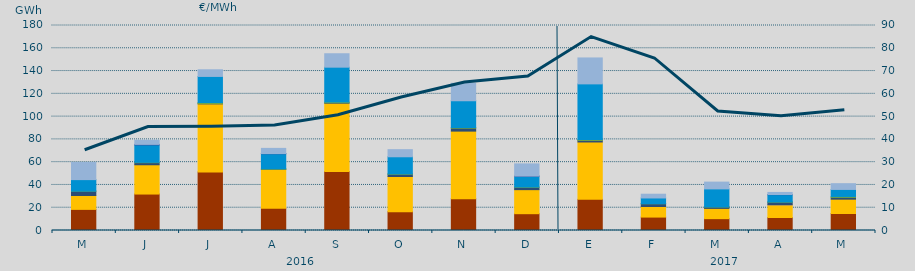
| Category | Carbón | Ciclo Combinado | Cogeneración | Consumo Bombeo | Eólica | Hidráulica | Nuclear | Turbinación bombeo |
|---|---|---|---|---|---|---|---|---|
| M | 18542.9 | 12194.7 | 0 | 3802.8 | 29.4 | 10110.1 | 0 | 15019.5 |
| J | 32003.2 | 25715 | 0 | 1834 | 309.7 | 15345.5 | 404.7 | 3667.5 |
| J | 51324.2 | 59857.5 | 0 | 381.3 | 830.5 | 22884.7 | 0 | 5850 |
| A | 19608 | 34074 | 0 | 154.8 | 407.6 | 13164.8 | 150 | 4538.1 |
| S | 51777.2 | 60003.2 | 0 | 418.8 | 585.4 | 30624.4 | 0 | 11791 |
| O | 16527.1 | 30870.5 | 0 | 2014.8 | 341.7 | 14982.5 | 0 | 6233.4 |
| N | 27911.6 | 59353 | 0 | 2603.5 | 562.8 | 23494.9 | 0 | 15319.9 |
| D | 14759.8 | 21112.2 | 0 | 2054.9 | 290 | 9517.7 | 60 | 10705.2 |
| E | 27333.2 | 50390.4 | 0 | 1420.1 | 796.7 | 48799.7 | 0 | 22768.5 |
| F | 11782.3 | 9297.4 | 0 | 2429.3 | 37.7 | 5011.6 | 0 | 3301.6 |
| M | 10392.3 | 9024.8 | 0 | 1213 | 83.9 | 15815.6 | 0 | 5970.4 |
| A | 11417.3 | 11177.4 | 1 | 2298.7 | 146.3 | 6448.1 | 105 | 1824.9 |
| M | 14921.9 | 12578.5 | 0 | 1623.5 | 791 | 6148.7 | 0 | 5041.6 |